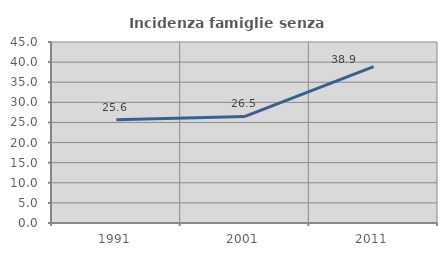
| Category | Incidenza famiglie senza nuclei |
|---|---|
| 1991.0 | 25.649 |
| 2001.0 | 26.49 |
| 2011.0 | 38.872 |